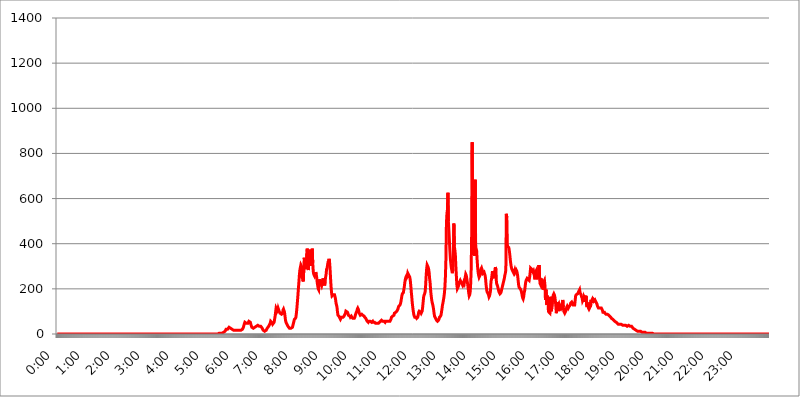
| Category | 2017.07.27. Intenzitás [W/m^2] |
|---|---|
| 0.0 | 0 |
| 0.0006944444444444445 | 0 |
| 0.001388888888888889 | 0 |
| 0.0020833333333333333 | 0 |
| 0.002777777777777778 | 0 |
| 0.003472222222222222 | 0 |
| 0.004166666666666667 | 0 |
| 0.004861111111111111 | 0 |
| 0.005555555555555556 | 0 |
| 0.0062499999999999995 | 0 |
| 0.006944444444444444 | 0 |
| 0.007638888888888889 | 0 |
| 0.008333333333333333 | 0 |
| 0.009027777777777779 | 0 |
| 0.009722222222222222 | 0 |
| 0.010416666666666666 | 0 |
| 0.011111111111111112 | 0 |
| 0.011805555555555555 | 0 |
| 0.012499999999999999 | 0 |
| 0.013194444444444444 | 0 |
| 0.013888888888888888 | 0 |
| 0.014583333333333332 | 0 |
| 0.015277777777777777 | 0 |
| 0.015972222222222224 | 0 |
| 0.016666666666666666 | 0 |
| 0.017361111111111112 | 0 |
| 0.018055555555555557 | 0 |
| 0.01875 | 0 |
| 0.019444444444444445 | 0 |
| 0.02013888888888889 | 0 |
| 0.020833333333333332 | 0 |
| 0.02152777777777778 | 0 |
| 0.022222222222222223 | 0 |
| 0.02291666666666667 | 0 |
| 0.02361111111111111 | 0 |
| 0.024305555555555556 | 0 |
| 0.024999999999999998 | 0 |
| 0.025694444444444447 | 0 |
| 0.02638888888888889 | 0 |
| 0.027083333333333334 | 0 |
| 0.027777777777777776 | 0 |
| 0.02847222222222222 | 0 |
| 0.029166666666666664 | 0 |
| 0.029861111111111113 | 0 |
| 0.030555555555555555 | 0 |
| 0.03125 | 0 |
| 0.03194444444444445 | 0 |
| 0.03263888888888889 | 0 |
| 0.03333333333333333 | 0 |
| 0.034027777777777775 | 0 |
| 0.034722222222222224 | 0 |
| 0.035416666666666666 | 0 |
| 0.036111111111111115 | 0 |
| 0.03680555555555556 | 0 |
| 0.0375 | 0 |
| 0.03819444444444444 | 0 |
| 0.03888888888888889 | 0 |
| 0.03958333333333333 | 0 |
| 0.04027777777777778 | 0 |
| 0.04097222222222222 | 0 |
| 0.041666666666666664 | 0 |
| 0.042361111111111106 | 0 |
| 0.04305555555555556 | 0 |
| 0.043750000000000004 | 0 |
| 0.044444444444444446 | 0 |
| 0.04513888888888889 | 0 |
| 0.04583333333333334 | 0 |
| 0.04652777777777778 | 0 |
| 0.04722222222222222 | 0 |
| 0.04791666666666666 | 0 |
| 0.04861111111111111 | 0 |
| 0.049305555555555554 | 0 |
| 0.049999999999999996 | 0 |
| 0.05069444444444445 | 0 |
| 0.051388888888888894 | 0 |
| 0.052083333333333336 | 0 |
| 0.05277777777777778 | 0 |
| 0.05347222222222222 | 0 |
| 0.05416666666666667 | 0 |
| 0.05486111111111111 | 0 |
| 0.05555555555555555 | 0 |
| 0.05625 | 0 |
| 0.05694444444444444 | 0 |
| 0.057638888888888885 | 0 |
| 0.05833333333333333 | 0 |
| 0.05902777777777778 | 0 |
| 0.059722222222222225 | 0 |
| 0.06041666666666667 | 0 |
| 0.061111111111111116 | 0 |
| 0.06180555555555556 | 0 |
| 0.0625 | 0 |
| 0.06319444444444444 | 0 |
| 0.06388888888888888 | 0 |
| 0.06458333333333334 | 0 |
| 0.06527777777777778 | 0 |
| 0.06597222222222222 | 0 |
| 0.06666666666666667 | 0 |
| 0.06736111111111111 | 0 |
| 0.06805555555555555 | 0 |
| 0.06874999999999999 | 0 |
| 0.06944444444444443 | 0 |
| 0.07013888888888889 | 0 |
| 0.07083333333333333 | 0 |
| 0.07152777777777779 | 0 |
| 0.07222222222222223 | 0 |
| 0.07291666666666667 | 0 |
| 0.07361111111111111 | 0 |
| 0.07430555555555556 | 0 |
| 0.075 | 0 |
| 0.07569444444444444 | 0 |
| 0.0763888888888889 | 0 |
| 0.07708333333333334 | 0 |
| 0.07777777777777778 | 0 |
| 0.07847222222222222 | 0 |
| 0.07916666666666666 | 0 |
| 0.0798611111111111 | 0 |
| 0.08055555555555556 | 0 |
| 0.08125 | 0 |
| 0.08194444444444444 | 0 |
| 0.08263888888888889 | 0 |
| 0.08333333333333333 | 0 |
| 0.08402777777777777 | 0 |
| 0.08472222222222221 | 0 |
| 0.08541666666666665 | 0 |
| 0.08611111111111112 | 0 |
| 0.08680555555555557 | 0 |
| 0.08750000000000001 | 0 |
| 0.08819444444444445 | 0 |
| 0.08888888888888889 | 0 |
| 0.08958333333333333 | 0 |
| 0.09027777777777778 | 0 |
| 0.09097222222222222 | 0 |
| 0.09166666666666667 | 0 |
| 0.09236111111111112 | 0 |
| 0.09305555555555556 | 0 |
| 0.09375 | 0 |
| 0.09444444444444444 | 0 |
| 0.09513888888888888 | 0 |
| 0.09583333333333333 | 0 |
| 0.09652777777777777 | 0 |
| 0.09722222222222222 | 0 |
| 0.09791666666666667 | 0 |
| 0.09861111111111111 | 0 |
| 0.09930555555555555 | 0 |
| 0.09999999999999999 | 0 |
| 0.10069444444444443 | 0 |
| 0.1013888888888889 | 0 |
| 0.10208333333333335 | 0 |
| 0.10277777777777779 | 0 |
| 0.10347222222222223 | 0 |
| 0.10416666666666667 | 0 |
| 0.10486111111111111 | 0 |
| 0.10555555555555556 | 0 |
| 0.10625 | 0 |
| 0.10694444444444444 | 0 |
| 0.1076388888888889 | 0 |
| 0.10833333333333334 | 0 |
| 0.10902777777777778 | 0 |
| 0.10972222222222222 | 0 |
| 0.1111111111111111 | 0 |
| 0.11180555555555556 | 0 |
| 0.11180555555555556 | 0 |
| 0.1125 | 0 |
| 0.11319444444444444 | 0 |
| 0.11388888888888889 | 0 |
| 0.11458333333333333 | 0 |
| 0.11527777777777777 | 0 |
| 0.11597222222222221 | 0 |
| 0.11666666666666665 | 0 |
| 0.1173611111111111 | 0 |
| 0.11805555555555557 | 0 |
| 0.11944444444444445 | 0 |
| 0.12013888888888889 | 0 |
| 0.12083333333333333 | 0 |
| 0.12152777777777778 | 0 |
| 0.12222222222222223 | 0 |
| 0.12291666666666667 | 0 |
| 0.12291666666666667 | 0 |
| 0.12361111111111112 | 0 |
| 0.12430555555555556 | 0 |
| 0.125 | 0 |
| 0.12569444444444444 | 0 |
| 0.12638888888888888 | 0 |
| 0.12708333333333333 | 0 |
| 0.16875 | 0 |
| 0.12847222222222224 | 0 |
| 0.12916666666666668 | 0 |
| 0.12986111111111112 | 0 |
| 0.13055555555555556 | 0 |
| 0.13125 | 0 |
| 0.13194444444444445 | 0 |
| 0.1326388888888889 | 0 |
| 0.13333333333333333 | 0 |
| 0.13402777777777777 | 0 |
| 0.13402777777777777 | 0 |
| 0.13472222222222222 | 0 |
| 0.13541666666666666 | 0 |
| 0.1361111111111111 | 0 |
| 0.13749999999999998 | 0 |
| 0.13819444444444443 | 0 |
| 0.1388888888888889 | 0 |
| 0.13958333333333334 | 0 |
| 0.14027777777777778 | 0 |
| 0.14097222222222222 | 0 |
| 0.14166666666666666 | 0 |
| 0.1423611111111111 | 0 |
| 0.14305555555555557 | 0 |
| 0.14375000000000002 | 0 |
| 0.14444444444444446 | 0 |
| 0.1451388888888889 | 0 |
| 0.1451388888888889 | 0 |
| 0.14652777777777778 | 0 |
| 0.14722222222222223 | 0 |
| 0.14791666666666667 | 0 |
| 0.1486111111111111 | 0 |
| 0.14930555555555555 | 0 |
| 0.15 | 0 |
| 0.15069444444444444 | 0 |
| 0.15138888888888888 | 0 |
| 0.15208333333333332 | 0 |
| 0.15277777777777776 | 0 |
| 0.15347222222222223 | 0 |
| 0.15416666666666667 | 0 |
| 0.15486111111111112 | 0 |
| 0.15555555555555556 | 0 |
| 0.15625 | 0 |
| 0.15694444444444444 | 0 |
| 0.15763888888888888 | 0 |
| 0.15833333333333333 | 0 |
| 0.15902777777777777 | 0 |
| 0.15972222222222224 | 0 |
| 0.16041666666666668 | 0 |
| 0.16111111111111112 | 0 |
| 0.16180555555555556 | 0 |
| 0.1625 | 0 |
| 0.16319444444444445 | 0 |
| 0.1638888888888889 | 0 |
| 0.16458333333333333 | 0 |
| 0.16527777777777777 | 0 |
| 0.16597222222222222 | 0 |
| 0.16666666666666666 | 0 |
| 0.1673611111111111 | 0 |
| 0.16805555555555554 | 0 |
| 0.16874999999999998 | 0 |
| 0.16944444444444443 | 0 |
| 0.17013888888888887 | 0 |
| 0.1708333333333333 | 0 |
| 0.17152777777777775 | 0 |
| 0.17222222222222225 | 0 |
| 0.1729166666666667 | 0 |
| 0.17361111111111113 | 0 |
| 0.17430555555555557 | 0 |
| 0.17500000000000002 | 0 |
| 0.17569444444444446 | 0 |
| 0.1763888888888889 | 0 |
| 0.17708333333333334 | 0 |
| 0.17777777777777778 | 0 |
| 0.17847222222222223 | 0 |
| 0.17916666666666667 | 0 |
| 0.1798611111111111 | 0 |
| 0.18055555555555555 | 0 |
| 0.18125 | 0 |
| 0.18194444444444444 | 0 |
| 0.1826388888888889 | 0 |
| 0.18333333333333335 | 0 |
| 0.1840277777777778 | 0 |
| 0.18472222222222223 | 0 |
| 0.18541666666666667 | 0 |
| 0.18611111111111112 | 0 |
| 0.18680555555555556 | 0 |
| 0.1875 | 0 |
| 0.18819444444444444 | 0 |
| 0.18888888888888888 | 0 |
| 0.18958333333333333 | 0 |
| 0.19027777777777777 | 0 |
| 0.1909722222222222 | 0 |
| 0.19166666666666665 | 0 |
| 0.19236111111111112 | 0 |
| 0.19305555555555554 | 0 |
| 0.19375 | 0 |
| 0.19444444444444445 | 0 |
| 0.1951388888888889 | 0 |
| 0.19583333333333333 | 0 |
| 0.19652777777777777 | 0 |
| 0.19722222222222222 | 0 |
| 0.19791666666666666 | 0 |
| 0.1986111111111111 | 0 |
| 0.19930555555555554 | 0 |
| 0.19999999999999998 | 0 |
| 0.20069444444444443 | 0 |
| 0.20138888888888887 | 0 |
| 0.2020833333333333 | 0 |
| 0.2027777777777778 | 0 |
| 0.2034722222222222 | 0 |
| 0.2041666666666667 | 0 |
| 0.20486111111111113 | 0 |
| 0.20555555555555557 | 0 |
| 0.20625000000000002 | 0 |
| 0.20694444444444446 | 0 |
| 0.2076388888888889 | 0 |
| 0.20833333333333334 | 0 |
| 0.20902777777777778 | 0 |
| 0.20972222222222223 | 0 |
| 0.21041666666666667 | 0 |
| 0.2111111111111111 | 0 |
| 0.21180555555555555 | 0 |
| 0.2125 | 0 |
| 0.21319444444444444 | 0 |
| 0.2138888888888889 | 0 |
| 0.21458333333333335 | 0 |
| 0.2152777777777778 | 0 |
| 0.21597222222222223 | 0 |
| 0.21666666666666667 | 0 |
| 0.21736111111111112 | 0 |
| 0.21805555555555556 | 0 |
| 0.21875 | 0 |
| 0.21944444444444444 | 0 |
| 0.22013888888888888 | 0 |
| 0.22083333333333333 | 0 |
| 0.22152777777777777 | 0 |
| 0.2222222222222222 | 0 |
| 0.22291666666666665 | 0 |
| 0.2236111111111111 | 0 |
| 0.22430555555555556 | 0 |
| 0.225 | 0 |
| 0.22569444444444445 | 0 |
| 0.2263888888888889 | 3.525 |
| 0.22708333333333333 | 3.525 |
| 0.22777777777777777 | 3.525 |
| 0.22847222222222222 | 3.525 |
| 0.22916666666666666 | 3.525 |
| 0.2298611111111111 | 3.525 |
| 0.23055555555555554 | 3.525 |
| 0.23124999999999998 | 3.525 |
| 0.23194444444444443 | 3.525 |
| 0.23263888888888887 | 3.525 |
| 0.2333333333333333 | 7.887 |
| 0.2340277777777778 | 7.887 |
| 0.2347222222222222 | 12.257 |
| 0.2354166666666667 | 12.257 |
| 0.23611111111111113 | 16.636 |
| 0.23680555555555557 | 21.024 |
| 0.23750000000000002 | 21.024 |
| 0.23819444444444446 | 21.024 |
| 0.2388888888888889 | 21.024 |
| 0.23958333333333334 | 25.419 |
| 0.24027777777777778 | 25.419 |
| 0.24097222222222223 | 29.823 |
| 0.24166666666666667 | 29.823 |
| 0.2423611111111111 | 29.823 |
| 0.24305555555555555 | 25.419 |
| 0.24375 | 21.024 |
| 0.24444444444444446 | 21.024 |
| 0.24513888888888888 | 21.024 |
| 0.24583333333333335 | 21.024 |
| 0.2465277777777778 | 16.636 |
| 0.24722222222222223 | 16.636 |
| 0.24791666666666667 | 16.636 |
| 0.24861111111111112 | 16.636 |
| 0.24930555555555556 | 16.636 |
| 0.25 | 16.636 |
| 0.25069444444444444 | 16.636 |
| 0.2513888888888889 | 16.636 |
| 0.2520833333333333 | 16.636 |
| 0.25277777777777777 | 16.636 |
| 0.2534722222222222 | 16.636 |
| 0.25416666666666665 | 16.636 |
| 0.2548611111111111 | 16.636 |
| 0.2555555555555556 | 16.636 |
| 0.25625000000000003 | 12.257 |
| 0.2569444444444445 | 12.257 |
| 0.2576388888888889 | 16.636 |
| 0.25833333333333336 | 16.636 |
| 0.2590277777777778 | 21.024 |
| 0.25972222222222224 | 21.024 |
| 0.2604166666666667 | 25.419 |
| 0.2611111111111111 | 29.823 |
| 0.26180555555555557 | 38.653 |
| 0.2625 | 43.079 |
| 0.26319444444444445 | 51.951 |
| 0.2638888888888889 | 51.951 |
| 0.26458333333333334 | 51.951 |
| 0.2652777777777778 | 47.511 |
| 0.2659722222222222 | 47.511 |
| 0.26666666666666666 | 47.511 |
| 0.2673611111111111 | 47.511 |
| 0.26805555555555555 | 51.951 |
| 0.26875 | 56.398 |
| 0.26944444444444443 | 56.398 |
| 0.2701388888888889 | 56.398 |
| 0.2708333333333333 | 51.951 |
| 0.27152777777777776 | 43.079 |
| 0.2722222222222222 | 38.653 |
| 0.27291666666666664 | 29.823 |
| 0.2736111111111111 | 29.823 |
| 0.2743055555555555 | 25.419 |
| 0.27499999999999997 | 25.419 |
| 0.27569444444444446 | 29.823 |
| 0.27638888888888885 | 29.823 |
| 0.27708333333333335 | 29.823 |
| 0.2777777777777778 | 29.823 |
| 0.27847222222222223 | 29.823 |
| 0.2791666666666667 | 34.234 |
| 0.2798611111111111 | 38.653 |
| 0.28055555555555556 | 38.653 |
| 0.28125 | 38.653 |
| 0.28194444444444444 | 34.234 |
| 0.2826388888888889 | 34.234 |
| 0.2833333333333333 | 34.234 |
| 0.28402777777777777 | 38.653 |
| 0.2847222222222222 | 38.653 |
| 0.28541666666666665 | 34.234 |
| 0.28611111111111115 | 29.823 |
| 0.28680555555555554 | 29.823 |
| 0.28750000000000003 | 25.419 |
| 0.2881944444444445 | 21.024 |
| 0.2888888888888889 | 16.636 |
| 0.28958333333333336 | 16.636 |
| 0.2902777777777778 | 12.257 |
| 0.29097222222222224 | 12.257 |
| 0.2916666666666667 | 12.257 |
| 0.2923611111111111 | 16.636 |
| 0.29305555555555557 | 16.636 |
| 0.29375 | 21.024 |
| 0.29444444444444445 | 25.419 |
| 0.2951388888888889 | 25.419 |
| 0.29583333333333334 | 29.823 |
| 0.2965277777777778 | 34.234 |
| 0.2972222222222222 | 38.653 |
| 0.29791666666666666 | 43.079 |
| 0.2986111111111111 | 47.511 |
| 0.29930555555555555 | 56.398 |
| 0.3 | 56.398 |
| 0.30069444444444443 | 51.951 |
| 0.3013888888888889 | 47.511 |
| 0.3020833333333333 | 43.079 |
| 0.30277777777777776 | 38.653 |
| 0.3034722222222222 | 43.079 |
| 0.30416666666666664 | 51.951 |
| 0.3048611111111111 | 65.31 |
| 0.3055555555555555 | 78.722 |
| 0.30624999999999997 | 96.682 |
| 0.3069444444444444 | 114.716 |
| 0.3076388888888889 | 110.201 |
| 0.30833333333333335 | 101.184 |
| 0.3090277777777778 | 105.69 |
| 0.30972222222222223 | 114.716 |
| 0.3104166666666667 | 114.716 |
| 0.3111111111111111 | 101.184 |
| 0.31180555555555556 | 96.682 |
| 0.3125 | 92.184 |
| 0.31319444444444444 | 92.184 |
| 0.3138888888888889 | 92.184 |
| 0.3145833333333333 | 87.692 |
| 0.31527777777777777 | 87.692 |
| 0.3159722222222222 | 92.184 |
| 0.31666666666666665 | 105.69 |
| 0.31736111111111115 | 110.201 |
| 0.31805555555555554 | 110.201 |
| 0.31875000000000003 | 96.682 |
| 0.3194444444444445 | 78.722 |
| 0.3201388888888889 | 60.85 |
| 0.32083333333333336 | 51.951 |
| 0.3215277777777778 | 47.511 |
| 0.32222222222222224 | 43.079 |
| 0.3229166666666667 | 38.653 |
| 0.3236111111111111 | 34.234 |
| 0.32430555555555557 | 29.823 |
| 0.325 | 29.823 |
| 0.32569444444444445 | 25.419 |
| 0.3263888888888889 | 25.419 |
| 0.32708333333333334 | 25.419 |
| 0.3277777777777778 | 25.419 |
| 0.3284722222222222 | 25.419 |
| 0.32916666666666666 | 25.419 |
| 0.3298611111111111 | 29.823 |
| 0.33055555555555555 | 38.653 |
| 0.33125 | 47.511 |
| 0.33194444444444443 | 56.398 |
| 0.3326388888888889 | 65.31 |
| 0.3333333333333333 | 65.31 |
| 0.3340277777777778 | 69.775 |
| 0.3347222222222222 | 74.246 |
| 0.3354166666666667 | 92.184 |
| 0.3361111111111111 | 114.716 |
| 0.3368055555555556 | 141.884 |
| 0.33749999999999997 | 169.156 |
| 0.33819444444444446 | 201.058 |
| 0.33888888888888885 | 228.436 |
| 0.33958333333333335 | 260.373 |
| 0.34027777777777773 | 283.156 |
| 0.34097222222222223 | 283.156 |
| 0.3416666666666666 | 305.898 |
| 0.3423611111111111 | 305.898 |
| 0.3430555555555555 | 296.808 |
| 0.34375 | 251.251 |
| 0.3444444444444445 | 237.564 |
| 0.3451388888888889 | 233 |
| 0.3458333333333334 | 296.808 |
| 0.34652777777777777 | 337.639 |
| 0.34722222222222227 | 287.709 |
| 0.34791666666666665 | 305.898 |
| 0.34861111111111115 | 314.98 |
| 0.34930555555555554 | 287.709 |
| 0.35000000000000003 | 355.712 |
| 0.3506944444444444 | 378.224 |
| 0.3513888888888889 | 305.898 |
| 0.3520833333333333 | 283.156 |
| 0.3527777777777778 | 283.156 |
| 0.3534722222222222 | 351.198 |
| 0.3541666666666667 | 333.113 |
| 0.3548611111111111 | 301.354 |
| 0.35555555555555557 | 373.729 |
| 0.35625 | 324.052 |
| 0.35694444444444445 | 346.682 |
| 0.3576388888888889 | 378.224 |
| 0.35833333333333334 | 314.98 |
| 0.3590277777777778 | 278.603 |
| 0.3597222222222222 | 264.932 |
| 0.36041666666666666 | 260.373 |
| 0.3611111111111111 | 255.813 |
| 0.36180555555555555 | 260.373 |
| 0.3625 | 274.047 |
| 0.36319444444444443 | 264.932 |
| 0.3638888888888889 | 251.251 |
| 0.3645833333333333 | 228.436 |
| 0.3652777777777778 | 214.746 |
| 0.3659722222222222 | 201.058 |
| 0.3666666666666667 | 196.497 |
| 0.3673611111111111 | 223.873 |
| 0.3680555555555556 | 242.127 |
| 0.36874999999999997 | 233 |
| 0.36944444444444446 | 233 |
| 0.37013888888888885 | 233 |
| 0.37083333333333335 | 214.746 |
| 0.37152777777777773 | 214.746 |
| 0.37222222222222223 | 233 |
| 0.3729166666666666 | 246.689 |
| 0.3736111111111111 | 237.564 |
| 0.3743055555555555 | 228.436 |
| 0.375 | 214.746 |
| 0.3756944444444445 | 233 |
| 0.3763888888888889 | 251.251 |
| 0.3770833333333334 | 264.932 |
| 0.37777777777777777 | 287.709 |
| 0.37847222222222227 | 292.259 |
| 0.37916666666666665 | 305.898 |
| 0.37986111111111115 | 319.517 |
| 0.38055555555555554 | 324.052 |
| 0.38125000000000003 | 333.113 |
| 0.3819444444444444 | 319.517 |
| 0.3826388888888889 | 287.709 |
| 0.3833333333333333 | 246.689 |
| 0.3840277777777778 | 210.182 |
| 0.3847222222222222 | 182.82 |
| 0.3854166666666667 | 169.156 |
| 0.3861111111111111 | 169.156 |
| 0.38680555555555557 | 173.709 |
| 0.3875 | 173.709 |
| 0.38819444444444445 | 173.709 |
| 0.3888888888888889 | 173.709 |
| 0.38958333333333334 | 164.605 |
| 0.3902777777777778 | 155.509 |
| 0.3909722222222222 | 137.347 |
| 0.39166666666666666 | 128.284 |
| 0.3923611111111111 | 119.235 |
| 0.39305555555555555 | 96.682 |
| 0.39375 | 83.205 |
| 0.39444444444444443 | 83.205 |
| 0.3951388888888889 | 78.722 |
| 0.3958333333333333 | 74.246 |
| 0.3965277777777778 | 69.775 |
| 0.3972222222222222 | 65.31 |
| 0.3979166666666667 | 65.31 |
| 0.3986111111111111 | 74.246 |
| 0.3993055555555556 | 74.246 |
| 0.39999999999999997 | 74.246 |
| 0.40069444444444446 | 74.246 |
| 0.40138888888888885 | 74.246 |
| 0.40208333333333335 | 78.722 |
| 0.40277777777777773 | 83.205 |
| 0.40347222222222223 | 87.692 |
| 0.4041666666666666 | 92.184 |
| 0.4048611111111111 | 101.184 |
| 0.4055555555555555 | 101.184 |
| 0.40625 | 101.184 |
| 0.4069444444444445 | 96.682 |
| 0.4076388888888889 | 92.184 |
| 0.4083333333333334 | 83.205 |
| 0.40902777777777777 | 83.205 |
| 0.40972222222222227 | 83.205 |
| 0.41041666666666665 | 78.722 |
| 0.41111111111111115 | 74.246 |
| 0.41180555555555554 | 74.246 |
| 0.41250000000000003 | 78.722 |
| 0.4131944444444444 | 74.246 |
| 0.4138888888888889 | 74.246 |
| 0.4145833333333333 | 69.775 |
| 0.4152777777777778 | 69.775 |
| 0.4159722222222222 | 69.775 |
| 0.4166666666666667 | 69.775 |
| 0.4173611111111111 | 74.246 |
| 0.41805555555555557 | 83.205 |
| 0.41875 | 83.205 |
| 0.41944444444444445 | 96.682 |
| 0.4201388888888889 | 101.184 |
| 0.42083333333333334 | 110.201 |
| 0.4215277777777778 | 114.716 |
| 0.4222222222222222 | 110.201 |
| 0.42291666666666666 | 101.184 |
| 0.4236111111111111 | 92.184 |
| 0.42430555555555555 | 87.692 |
| 0.425 | 83.205 |
| 0.42569444444444443 | 83.205 |
| 0.4263888888888889 | 83.205 |
| 0.4270833333333333 | 87.692 |
| 0.4277777777777778 | 87.692 |
| 0.4284722222222222 | 83.205 |
| 0.4291666666666667 | 83.205 |
| 0.4298611111111111 | 83.205 |
| 0.4305555555555556 | 78.722 |
| 0.43124999999999997 | 74.246 |
| 0.43194444444444446 | 74.246 |
| 0.43263888888888885 | 69.775 |
| 0.43333333333333335 | 65.31 |
| 0.43402777777777773 | 65.31 |
| 0.43472222222222223 | 56.398 |
| 0.4354166666666666 | 56.398 |
| 0.4361111111111111 | 51.951 |
| 0.4368055555555555 | 56.398 |
| 0.4375 | 56.398 |
| 0.4381944444444445 | 56.398 |
| 0.4388888888888889 | 56.398 |
| 0.4395833333333334 | 56.398 |
| 0.44027777777777777 | 56.398 |
| 0.44097222222222227 | 51.951 |
| 0.44166666666666665 | 51.951 |
| 0.44236111111111115 | 56.398 |
| 0.44305555555555554 | 51.951 |
| 0.44375000000000003 | 51.951 |
| 0.4444444444444444 | 51.951 |
| 0.4451388888888889 | 51.951 |
| 0.4458333333333333 | 51.951 |
| 0.4465277777777778 | 47.511 |
| 0.4472222222222222 | 47.511 |
| 0.4479166666666667 | 47.511 |
| 0.4486111111111111 | 47.511 |
| 0.44930555555555557 | 47.511 |
| 0.45 | 47.511 |
| 0.45069444444444445 | 47.511 |
| 0.4513888888888889 | 47.511 |
| 0.45208333333333334 | 51.951 |
| 0.4527777777777778 | 51.951 |
| 0.4534722222222222 | 56.398 |
| 0.45416666666666666 | 56.398 |
| 0.4548611111111111 | 60.85 |
| 0.45555555555555555 | 60.85 |
| 0.45625 | 56.398 |
| 0.45694444444444443 | 56.398 |
| 0.4576388888888889 | 56.398 |
| 0.4583333333333333 | 56.398 |
| 0.4590277777777778 | 56.398 |
| 0.4597222222222222 | 51.951 |
| 0.4604166666666667 | 56.398 |
| 0.4611111111111111 | 56.398 |
| 0.4618055555555556 | 56.398 |
| 0.46249999999999997 | 56.398 |
| 0.46319444444444446 | 56.398 |
| 0.46388888888888885 | 56.398 |
| 0.46458333333333335 | 56.398 |
| 0.46527777777777773 | 56.398 |
| 0.46597222222222223 | 56.398 |
| 0.4666666666666666 | 56.398 |
| 0.4673611111111111 | 60.85 |
| 0.4680555555555555 | 65.31 |
| 0.46875 | 74.246 |
| 0.4694444444444445 | 74.246 |
| 0.4701388888888889 | 78.722 |
| 0.4708333333333334 | 78.722 |
| 0.47152777777777777 | 78.722 |
| 0.47222222222222227 | 83.205 |
| 0.47291666666666665 | 92.184 |
| 0.47361111111111115 | 92.184 |
| 0.47430555555555554 | 92.184 |
| 0.47500000000000003 | 96.682 |
| 0.4756944444444444 | 96.682 |
| 0.4763888888888889 | 101.184 |
| 0.4770833333333333 | 105.69 |
| 0.4777777777777778 | 110.201 |
| 0.4784722222222222 | 119.235 |
| 0.4791666666666667 | 123.758 |
| 0.4798611111111111 | 123.758 |
| 0.48055555555555557 | 128.284 |
| 0.48125 | 132.814 |
| 0.48194444444444445 | 141.884 |
| 0.4826388888888889 | 155.509 |
| 0.48333333333333334 | 169.156 |
| 0.4840277777777778 | 178.264 |
| 0.4847222222222222 | 178.264 |
| 0.48541666666666666 | 182.82 |
| 0.4861111111111111 | 196.497 |
| 0.48680555555555555 | 210.182 |
| 0.4875 | 228.436 |
| 0.48819444444444443 | 242.127 |
| 0.4888888888888889 | 251.251 |
| 0.4895833333333333 | 255.813 |
| 0.4902777777777778 | 251.251 |
| 0.4909722222222222 | 255.813 |
| 0.4916666666666667 | 269.49 |
| 0.4923611111111111 | 269.49 |
| 0.4930555555555556 | 260.373 |
| 0.49374999999999997 | 255.813 |
| 0.49444444444444446 | 251.251 |
| 0.49513888888888885 | 237.564 |
| 0.49583333333333335 | 214.746 |
| 0.49652777777777773 | 187.378 |
| 0.49722222222222223 | 164.605 |
| 0.4979166666666666 | 137.347 |
| 0.4986111111111111 | 119.235 |
| 0.4993055555555555 | 101.184 |
| 0.5 | 87.692 |
| 0.5006944444444444 | 78.722 |
| 0.5013888888888889 | 74.246 |
| 0.5020833333333333 | 74.246 |
| 0.5027777777777778 | 74.246 |
| 0.5034722222222222 | 74.246 |
| 0.5041666666666667 | 69.775 |
| 0.5048611111111111 | 69.775 |
| 0.5055555555555555 | 74.246 |
| 0.50625 | 83.205 |
| 0.5069444444444444 | 96.682 |
| 0.5076388888888889 | 101.184 |
| 0.5083333333333333 | 101.184 |
| 0.5090277777777777 | 101.184 |
| 0.5097222222222222 | 96.682 |
| 0.5104166666666666 | 92.184 |
| 0.5111111111111112 | 96.682 |
| 0.5118055555555555 | 101.184 |
| 0.5125000000000001 | 119.235 |
| 0.5131944444444444 | 141.884 |
| 0.513888888888889 | 164.605 |
| 0.5145833333333333 | 173.709 |
| 0.5152777777777778 | 178.264 |
| 0.5159722222222222 | 187.378 |
| 0.5166666666666667 | 214.746 |
| 0.517361111111111 | 255.813 |
| 0.5180555555555556 | 287.709 |
| 0.5187499999999999 | 305.898 |
| 0.5194444444444445 | 305.898 |
| 0.5201388888888888 | 296.808 |
| 0.5208333333333334 | 287.709 |
| 0.5215277777777778 | 274.047 |
| 0.5222222222222223 | 246.689 |
| 0.5229166666666667 | 228.436 |
| 0.5236111111111111 | 196.497 |
| 0.5243055555555556 | 173.709 |
| 0.525 | 155.509 |
| 0.5256944444444445 | 141.884 |
| 0.5263888888888889 | 132.814 |
| 0.5270833333333333 | 123.758 |
| 0.5277777777777778 | 110.201 |
| 0.5284722222222222 | 92.184 |
| 0.5291666666666667 | 78.722 |
| 0.5298611111111111 | 74.246 |
| 0.5305555555555556 | 69.775 |
| 0.53125 | 65.31 |
| 0.5319444444444444 | 60.85 |
| 0.5326388888888889 | 60.85 |
| 0.5333333333333333 | 56.398 |
| 0.5340277777777778 | 56.398 |
| 0.5347222222222222 | 60.85 |
| 0.5354166666666667 | 65.31 |
| 0.5361111111111111 | 74.246 |
| 0.5368055555555555 | 74.246 |
| 0.5375 | 78.722 |
| 0.5381944444444444 | 83.205 |
| 0.5388888888888889 | 96.682 |
| 0.5395833333333333 | 110.201 |
| 0.5402777777777777 | 128.284 |
| 0.5409722222222222 | 137.347 |
| 0.5416666666666666 | 150.964 |
| 0.5423611111111112 | 164.605 |
| 0.5430555555555555 | 182.82 |
| 0.5437500000000001 | 210.182 |
| 0.5444444444444444 | 255.813 |
| 0.545138888888889 | 333.113 |
| 0.5458333333333333 | 489.108 |
| 0.5465277777777778 | 532.513 |
| 0.5472222222222222 | 549.704 |
| 0.5479166666666667 | 625.784 |
| 0.548611111111111 | 497.836 |
| 0.5493055555555556 | 458.38 |
| 0.5499999999999999 | 414.035 |
| 0.5506944444444445 | 369.23 |
| 0.5513888888888888 | 333.113 |
| 0.5520833333333334 | 310.44 |
| 0.5527777777777778 | 292.259 |
| 0.5534722222222223 | 292.259 |
| 0.5541666666666667 | 269.49 |
| 0.5548611111111111 | 287.709 |
| 0.5555555555555556 | 346.682 |
| 0.55625 | 489.108 |
| 0.5569444444444445 | 387.202 |
| 0.5576388888888889 | 373.729 |
| 0.5583333333333333 | 351.198 |
| 0.5590277777777778 | 301.354 |
| 0.5597222222222222 | 260.373 |
| 0.5604166666666667 | 219.309 |
| 0.5611111111111111 | 201.058 |
| 0.5618055555555556 | 201.058 |
| 0.5625 | 210.182 |
| 0.5631944444444444 | 219.309 |
| 0.5638888888888889 | 228.436 |
| 0.5645833333333333 | 233 |
| 0.5652777777777778 | 237.564 |
| 0.5659722222222222 | 233 |
| 0.5666666666666667 | 228.436 |
| 0.5673611111111111 | 228.436 |
| 0.5680555555555555 | 219.309 |
| 0.56875 | 214.746 |
| 0.5694444444444444 | 219.309 |
| 0.5701388888888889 | 228.436 |
| 0.5708333333333333 | 223.873 |
| 0.5715277777777777 | 223.873 |
| 0.5722222222222222 | 251.251 |
| 0.5729166666666666 | 264.932 |
| 0.5736111111111112 | 260.373 |
| 0.5743055555555555 | 246.689 |
| 0.5750000000000001 | 233 |
| 0.5756944444444444 | 219.309 |
| 0.576388888888889 | 201.058 |
| 0.5770833333333333 | 182.82 |
| 0.5777777777777778 | 169.156 |
| 0.5784722222222222 | 173.709 |
| 0.5791666666666667 | 187.378 |
| 0.579861111111111 | 223.873 |
| 0.5805555555555556 | 287.709 |
| 0.5812499999999999 | 445.129 |
| 0.5819444444444445 | 849.199 |
| 0.5826388888888888 | 418.492 |
| 0.5833333333333334 | 409.574 |
| 0.5840277777777778 | 418.492 |
| 0.5847222222222223 | 360.221 |
| 0.5854166666666667 | 346.682 |
| 0.5861111111111111 | 683.473 |
| 0.5868055555555556 | 387.202 |
| 0.5875 | 387.202 |
| 0.5881944444444445 | 369.23 |
| 0.5888888888888889 | 328.584 |
| 0.5895833333333333 | 296.808 |
| 0.5902777777777778 | 274.047 |
| 0.5909722222222222 | 260.373 |
| 0.5916666666666667 | 251.251 |
| 0.5923611111111111 | 251.251 |
| 0.5930555555555556 | 260.373 |
| 0.59375 | 269.49 |
| 0.5944444444444444 | 287.709 |
| 0.5951388888888889 | 292.259 |
| 0.5958333333333333 | 292.259 |
| 0.5965277777777778 | 278.603 |
| 0.5972222222222222 | 269.49 |
| 0.5979166666666667 | 269.49 |
| 0.5986111111111111 | 274.047 |
| 0.5993055555555555 | 274.047 |
| 0.6 | 260.373 |
| 0.6006944444444444 | 246.689 |
| 0.6013888888888889 | 219.309 |
| 0.6020833333333333 | 201.058 |
| 0.6027777777777777 | 187.378 |
| 0.6034722222222222 | 182.82 |
| 0.6041666666666666 | 178.264 |
| 0.6048611111111112 | 173.709 |
| 0.6055555555555555 | 164.605 |
| 0.6062500000000001 | 169.156 |
| 0.6069444444444444 | 178.264 |
| 0.607638888888889 | 191.937 |
| 0.6083333333333333 | 233 |
| 0.6090277777777778 | 242.127 |
| 0.6097222222222222 | 260.373 |
| 0.6104166666666667 | 278.603 |
| 0.611111111111111 | 269.49 |
| 0.6118055555555556 | 264.932 |
| 0.6124999999999999 | 264.932 |
| 0.6131944444444445 | 246.689 |
| 0.6138888888888888 | 246.689 |
| 0.6145833333333334 | 296.808 |
| 0.6152777777777778 | 283.156 |
| 0.6159722222222223 | 228.436 |
| 0.6166666666666667 | 219.309 |
| 0.6173611111111111 | 214.746 |
| 0.6180555555555556 | 205.62 |
| 0.61875 | 196.497 |
| 0.6194444444444445 | 187.378 |
| 0.6201388888888889 | 182.82 |
| 0.6208333333333333 | 178.264 |
| 0.6215277777777778 | 178.264 |
| 0.6222222222222222 | 182.82 |
| 0.6229166666666667 | 191.937 |
| 0.6236111111111111 | 201.058 |
| 0.6243055555555556 | 210.182 |
| 0.625 | 219.309 |
| 0.6256944444444444 | 228.436 |
| 0.6263888888888889 | 237.564 |
| 0.6270833333333333 | 246.689 |
| 0.6277777777777778 | 260.373 |
| 0.6284722222222222 | 269.49 |
| 0.6291666666666667 | 283.156 |
| 0.6298611111111111 | 532.513 |
| 0.6305555555555555 | 515.223 |
| 0.63125 | 396.164 |
| 0.6319444444444444 | 387.202 |
| 0.6326388888888889 | 387.202 |
| 0.6333333333333333 | 382.715 |
| 0.6340277777777777 | 369.23 |
| 0.6347222222222222 | 351.198 |
| 0.6354166666666666 | 328.584 |
| 0.6361111111111112 | 310.44 |
| 0.6368055555555555 | 296.808 |
| 0.6375000000000001 | 287.709 |
| 0.6381944444444444 | 283.156 |
| 0.638888888888889 | 278.603 |
| 0.6395833333333333 | 274.047 |
| 0.6402777777777778 | 269.49 |
| 0.6409722222222222 | 269.49 |
| 0.6416666666666667 | 283.156 |
| 0.642361111111111 | 274.047 |
| 0.6430555555555556 | 278.603 |
| 0.6437499999999999 | 283.156 |
| 0.6444444444444445 | 278.603 |
| 0.6451388888888888 | 269.49 |
| 0.6458333333333334 | 255.813 |
| 0.6465277777777778 | 233 |
| 0.6472222222222223 | 214.746 |
| 0.6479166666666667 | 205.62 |
| 0.6486111111111111 | 205.62 |
| 0.6493055555555556 | 201.058 |
| 0.65 | 201.058 |
| 0.6506944444444445 | 191.937 |
| 0.6513888888888889 | 182.82 |
| 0.6520833333333333 | 169.156 |
| 0.6527777777777778 | 160.056 |
| 0.6534722222222222 | 155.509 |
| 0.6541666666666667 | 164.605 |
| 0.6548611111111111 | 182.82 |
| 0.6555555555555556 | 191.937 |
| 0.65625 | 210.182 |
| 0.6569444444444444 | 228.436 |
| 0.6576388888888889 | 237.564 |
| 0.6583333333333333 | 242.127 |
| 0.6590277777777778 | 246.689 |
| 0.6597222222222222 | 246.689 |
| 0.6604166666666667 | 242.127 |
| 0.6611111111111111 | 242.127 |
| 0.6618055555555555 | 237.564 |
| 0.6625 | 251.251 |
| 0.6631944444444444 | 269.49 |
| 0.6638888888888889 | 292.259 |
| 0.6645833333333333 | 292.259 |
| 0.6652777777777777 | 287.709 |
| 0.6659722222222222 | 287.709 |
| 0.6666666666666666 | 278.603 |
| 0.6673611111111111 | 274.047 |
| 0.6680555555555556 | 278.603 |
| 0.6687500000000001 | 269.49 |
| 0.6694444444444444 | 251.251 |
| 0.6701388888888888 | 242.127 |
| 0.6708333333333334 | 274.047 |
| 0.6715277777777778 | 278.603 |
| 0.6722222222222222 | 255.813 |
| 0.6729166666666666 | 242.127 |
| 0.6736111111111112 | 242.127 |
| 0.6743055555555556 | 264.932 |
| 0.6749999999999999 | 255.813 |
| 0.6756944444444444 | 305.898 |
| 0.6763888888888889 | 260.373 |
| 0.6770833333333334 | 223.873 |
| 0.6777777777777777 | 219.309 |
| 0.6784722222222223 | 246.689 |
| 0.6791666666666667 | 233 |
| 0.6798611111111111 | 219.309 |
| 0.6805555555555555 | 223.873 |
| 0.68125 | 223.873 |
| 0.6819444444444445 | 196.497 |
| 0.6826388888888889 | 233 |
| 0.6833333333333332 | 237.564 |
| 0.6840277777777778 | 214.746 |
| 0.6847222222222222 | 150.964 |
| 0.6854166666666667 | 196.497 |
| 0.686111111111111 | 196.497 |
| 0.6868055555555556 | 128.284 |
| 0.6875 | 169.156 |
| 0.6881944444444444 | 160.056 |
| 0.688888888888889 | 101.184 |
| 0.6895833333333333 | 96.682 |
| 0.6902777777777778 | 96.682 |
| 0.6909722222222222 | 92.184 |
| 0.6916666666666668 | 146.423 |
| 0.6923611111111111 | 164.605 |
| 0.6930555555555555 | 101.184 |
| 0.69375 | 101.184 |
| 0.6944444444444445 | 101.184 |
| 0.6951388888888889 | 164.605 |
| 0.6958333333333333 | 173.709 |
| 0.6965277777777777 | 178.264 |
| 0.6972222222222223 | 173.709 |
| 0.6979166666666666 | 164.605 |
| 0.6986111111111111 | 146.423 |
| 0.6993055555555556 | 123.758 |
| 0.7000000000000001 | 92.184 |
| 0.7006944444444444 | 114.716 |
| 0.7013888888888888 | 141.884 |
| 0.7020833333333334 | 123.758 |
| 0.7027777777777778 | 128.284 |
| 0.7034722222222222 | 101.184 |
| 0.7041666666666666 | 114.716 |
| 0.7048611111111112 | 128.284 |
| 0.7055555555555556 | 123.758 |
| 0.7062499999999999 | 123.758 |
| 0.7069444444444444 | 114.716 |
| 0.7076388888888889 | 119.235 |
| 0.7083333333333334 | 128.284 |
| 0.7090277777777777 | 150.964 |
| 0.7097222222222223 | 119.235 |
| 0.7104166666666667 | 101.184 |
| 0.7111111111111111 | 96.682 |
| 0.7118055555555555 | 92.184 |
| 0.7125 | 96.682 |
| 0.7131944444444445 | 101.184 |
| 0.7138888888888889 | 110.201 |
| 0.7145833333333332 | 119.235 |
| 0.7152777777777778 | 123.758 |
| 0.7159722222222222 | 119.235 |
| 0.7166666666666667 | 114.716 |
| 0.717361111111111 | 119.235 |
| 0.7180555555555556 | 119.235 |
| 0.71875 | 119.235 |
| 0.7194444444444444 | 128.284 |
| 0.720138888888889 | 137.347 |
| 0.7208333333333333 | 137.347 |
| 0.7215277777777778 | 141.884 |
| 0.7222222222222222 | 137.347 |
| 0.7229166666666668 | 137.347 |
| 0.7236111111111111 | 128.284 |
| 0.7243055555555555 | 128.284 |
| 0.725 | 128.284 |
| 0.7256944444444445 | 128.284 |
| 0.7263888888888889 | 128.284 |
| 0.7270833333333333 | 169.156 |
| 0.7277777777777777 | 173.709 |
| 0.7284722222222223 | 173.709 |
| 0.7291666666666666 | 173.709 |
| 0.7298611111111111 | 178.264 |
| 0.7305555555555556 | 182.82 |
| 0.7312500000000001 | 187.378 |
| 0.7319444444444444 | 191.937 |
| 0.7326388888888888 | 196.497 |
| 0.7333333333333334 | 182.82 |
| 0.7340277777777778 | 182.82 |
| 0.7347222222222222 | 173.709 |
| 0.7354166666666666 | 164.605 |
| 0.7361111111111112 | 160.056 |
| 0.7368055555555556 | 146.423 |
| 0.7374999999999999 | 150.964 |
| 0.7381944444444444 | 141.884 |
| 0.7388888888888889 | 164.605 |
| 0.7395833333333334 | 160.056 |
| 0.7402777777777777 | 169.156 |
| 0.7409722222222223 | 141.884 |
| 0.7416666666666667 | 169.156 |
| 0.7423611111111111 | 128.284 |
| 0.7430555555555555 | 119.235 |
| 0.74375 | 128.284 |
| 0.7444444444444445 | 123.758 |
| 0.7451388888888889 | 114.716 |
| 0.7458333333333332 | 110.201 |
| 0.7465277777777778 | 114.716 |
| 0.7472222222222222 | 141.884 |
| 0.7479166666666667 | 119.235 |
| 0.748611111111111 | 150.964 |
| 0.7493055555555556 | 146.423 |
| 0.75 | 150.964 |
| 0.7506944444444444 | 137.347 |
| 0.751388888888889 | 146.423 |
| 0.7520833333333333 | 150.964 |
| 0.7527777777777778 | 146.423 |
| 0.7534722222222222 | 146.423 |
| 0.7541666666666668 | 150.964 |
| 0.7548611111111111 | 146.423 |
| 0.7555555555555555 | 141.884 |
| 0.75625 | 137.347 |
| 0.7569444444444445 | 132.814 |
| 0.7576388888888889 | 123.758 |
| 0.7583333333333333 | 119.235 |
| 0.7590277777777777 | 114.716 |
| 0.7597222222222223 | 114.716 |
| 0.7604166666666666 | 114.716 |
| 0.7611111111111111 | 114.716 |
| 0.7618055555555556 | 114.716 |
| 0.7625000000000001 | 114.716 |
| 0.7631944444444444 | 114.716 |
| 0.7638888888888888 | 110.201 |
| 0.7645833333333334 | 105.69 |
| 0.7652777777777778 | 96.682 |
| 0.7659722222222222 | 96.682 |
| 0.7666666666666666 | 96.682 |
| 0.7673611111111112 | 96.682 |
| 0.7680555555555556 | 92.184 |
| 0.7687499999999999 | 92.184 |
| 0.7694444444444444 | 87.692 |
| 0.7701388888888889 | 87.692 |
| 0.7708333333333334 | 87.692 |
| 0.7715277777777777 | 87.692 |
| 0.7722222222222223 | 87.692 |
| 0.7729166666666667 | 87.692 |
| 0.7736111111111111 | 83.205 |
| 0.7743055555555555 | 83.205 |
| 0.775 | 78.722 |
| 0.7756944444444445 | 78.722 |
| 0.7763888888888889 | 74.246 |
| 0.7770833333333332 | 69.775 |
| 0.7777777777777778 | 69.775 |
| 0.7784722222222222 | 69.775 |
| 0.7791666666666667 | 65.31 |
| 0.779861111111111 | 65.31 |
| 0.7805555555555556 | 60.85 |
| 0.78125 | 60.85 |
| 0.7819444444444444 | 56.398 |
| 0.782638888888889 | 56.398 |
| 0.7833333333333333 | 56.398 |
| 0.7840277777777778 | 51.951 |
| 0.7847222222222222 | 51.951 |
| 0.7854166666666668 | 47.511 |
| 0.7861111111111111 | 47.511 |
| 0.7868055555555555 | 43.079 |
| 0.7875 | 43.079 |
| 0.7881944444444445 | 43.079 |
| 0.7888888888888889 | 43.079 |
| 0.7895833333333333 | 43.079 |
| 0.7902777777777777 | 43.079 |
| 0.7909722222222223 | 43.079 |
| 0.7916666666666666 | 43.079 |
| 0.7923611111111111 | 43.079 |
| 0.7930555555555556 | 38.653 |
| 0.7937500000000001 | 38.653 |
| 0.7944444444444444 | 38.653 |
| 0.7951388888888888 | 38.653 |
| 0.7958333333333334 | 38.653 |
| 0.7965277777777778 | 38.653 |
| 0.7972222222222222 | 38.653 |
| 0.7979166666666666 | 34.234 |
| 0.7986111111111112 | 34.234 |
| 0.7993055555555556 | 34.234 |
| 0.7999999999999999 | 34.234 |
| 0.8006944444444444 | 38.653 |
| 0.8013888888888889 | 38.653 |
| 0.8020833333333334 | 38.653 |
| 0.8027777777777777 | 38.653 |
| 0.8034722222222223 | 34.234 |
| 0.8041666666666667 | 34.234 |
| 0.8048611111111111 | 34.234 |
| 0.8055555555555555 | 34.234 |
| 0.80625 | 29.823 |
| 0.8069444444444445 | 29.823 |
| 0.8076388888888889 | 25.419 |
| 0.8083333333333332 | 25.419 |
| 0.8090277777777778 | 25.419 |
| 0.8097222222222222 | 21.024 |
| 0.8104166666666667 | 21.024 |
| 0.811111111111111 | 21.024 |
| 0.8118055555555556 | 16.636 |
| 0.8125 | 16.636 |
| 0.8131944444444444 | 16.636 |
| 0.813888888888889 | 12.257 |
| 0.8145833333333333 | 12.257 |
| 0.8152777777777778 | 12.257 |
| 0.8159722222222222 | 12.257 |
| 0.8166666666666668 | 7.887 |
| 0.8173611111111111 | 7.887 |
| 0.8180555555555555 | 12.257 |
| 0.81875 | 7.887 |
| 0.8194444444444445 | 7.887 |
| 0.8201388888888889 | 7.887 |
| 0.8208333333333333 | 7.887 |
| 0.8215277777777777 | 7.887 |
| 0.8222222222222223 | 7.887 |
| 0.8229166666666666 | 7.887 |
| 0.8236111111111111 | 7.887 |
| 0.8243055555555556 | 7.887 |
| 0.8250000000000001 | 7.887 |
| 0.8256944444444444 | 3.525 |
| 0.8263888888888888 | 3.525 |
| 0.8270833333333334 | 3.525 |
| 0.8277777777777778 | 3.525 |
| 0.8284722222222222 | 3.525 |
| 0.8291666666666666 | 3.525 |
| 0.8298611111111112 | 3.525 |
| 0.8305555555555556 | 3.525 |
| 0.8312499999999999 | 3.525 |
| 0.8319444444444444 | 3.525 |
| 0.8326388888888889 | 3.525 |
| 0.8333333333333334 | 3.525 |
| 0.8340277777777777 | 0 |
| 0.8347222222222223 | 3.525 |
| 0.8354166666666667 | 3.525 |
| 0.8361111111111111 | 0 |
| 0.8368055555555555 | 0 |
| 0.8375 | 0 |
| 0.8381944444444445 | 0 |
| 0.8388888888888889 | 0 |
| 0.8395833333333332 | 0 |
| 0.8402777777777778 | 0 |
| 0.8409722222222222 | 0 |
| 0.8416666666666667 | 0 |
| 0.842361111111111 | 0 |
| 0.8430555555555556 | 0 |
| 0.84375 | 0 |
| 0.8444444444444444 | 0 |
| 0.845138888888889 | 0 |
| 0.8458333333333333 | 0 |
| 0.8465277777777778 | 0 |
| 0.8472222222222222 | 0 |
| 0.8479166666666668 | 0 |
| 0.8486111111111111 | 0 |
| 0.8493055555555555 | 0 |
| 0.85 | 0 |
| 0.8506944444444445 | 0 |
| 0.8513888888888889 | 0 |
| 0.8520833333333333 | 0 |
| 0.8527777777777777 | 0 |
| 0.8534722222222223 | 0 |
| 0.8541666666666666 | 0 |
| 0.8548611111111111 | 0 |
| 0.8555555555555556 | 0 |
| 0.8562500000000001 | 0 |
| 0.8569444444444444 | 0 |
| 0.8576388888888888 | 0 |
| 0.8583333333333334 | 0 |
| 0.8590277777777778 | 0 |
| 0.8597222222222222 | 0 |
| 0.8604166666666666 | 0 |
| 0.8611111111111112 | 0 |
| 0.8618055555555556 | 0 |
| 0.8624999999999999 | 0 |
| 0.8631944444444444 | 0 |
| 0.8638888888888889 | 0 |
| 0.8645833333333334 | 0 |
| 0.8652777777777777 | 0 |
| 0.8659722222222223 | 0 |
| 0.8666666666666667 | 0 |
| 0.8673611111111111 | 0 |
| 0.8680555555555555 | 0 |
| 0.86875 | 0 |
| 0.8694444444444445 | 0 |
| 0.8701388888888889 | 0 |
| 0.8708333333333332 | 0 |
| 0.8715277777777778 | 0 |
| 0.8722222222222222 | 0 |
| 0.8729166666666667 | 0 |
| 0.873611111111111 | 0 |
| 0.8743055555555556 | 0 |
| 0.875 | 0 |
| 0.8756944444444444 | 0 |
| 0.876388888888889 | 0 |
| 0.8770833333333333 | 0 |
| 0.8777777777777778 | 0 |
| 0.8784722222222222 | 0 |
| 0.8791666666666668 | 0 |
| 0.8798611111111111 | 0 |
| 0.8805555555555555 | 0 |
| 0.88125 | 0 |
| 0.8819444444444445 | 0 |
| 0.8826388888888889 | 0 |
| 0.8833333333333333 | 0 |
| 0.8840277777777777 | 0 |
| 0.8847222222222223 | 0 |
| 0.8854166666666666 | 0 |
| 0.8861111111111111 | 0 |
| 0.8868055555555556 | 0 |
| 0.8875000000000001 | 0 |
| 0.8881944444444444 | 0 |
| 0.8888888888888888 | 0 |
| 0.8895833333333334 | 0 |
| 0.8902777777777778 | 0 |
| 0.8909722222222222 | 0 |
| 0.8916666666666666 | 0 |
| 0.8923611111111112 | 0 |
| 0.8930555555555556 | 0 |
| 0.8937499999999999 | 0 |
| 0.8944444444444444 | 0 |
| 0.8951388888888889 | 0 |
| 0.8958333333333334 | 0 |
| 0.8965277777777777 | 0 |
| 0.8972222222222223 | 0 |
| 0.8979166666666667 | 0 |
| 0.8986111111111111 | 0 |
| 0.8993055555555555 | 0 |
| 0.9 | 0 |
| 0.9006944444444445 | 0 |
| 0.9013888888888889 | 0 |
| 0.9020833333333332 | 0 |
| 0.9027777777777778 | 0 |
| 0.9034722222222222 | 0 |
| 0.9041666666666667 | 0 |
| 0.904861111111111 | 0 |
| 0.9055555555555556 | 0 |
| 0.90625 | 0 |
| 0.9069444444444444 | 0 |
| 0.907638888888889 | 0 |
| 0.9083333333333333 | 0 |
| 0.9090277777777778 | 0 |
| 0.9097222222222222 | 0 |
| 0.9104166666666668 | 0 |
| 0.9111111111111111 | 0 |
| 0.9118055555555555 | 0 |
| 0.9125 | 0 |
| 0.9131944444444445 | 0 |
| 0.9138888888888889 | 0 |
| 0.9145833333333333 | 0 |
| 0.9152777777777777 | 0 |
| 0.9159722222222223 | 0 |
| 0.9166666666666666 | 0 |
| 0.9173611111111111 | 0 |
| 0.9180555555555556 | 0 |
| 0.9187500000000001 | 0 |
| 0.9194444444444444 | 0 |
| 0.9201388888888888 | 0 |
| 0.9208333333333334 | 0 |
| 0.9215277777777778 | 0 |
| 0.9222222222222222 | 0 |
| 0.9229166666666666 | 0 |
| 0.9236111111111112 | 0 |
| 0.9243055555555556 | 0 |
| 0.9249999999999999 | 0 |
| 0.9256944444444444 | 0 |
| 0.9263888888888889 | 0 |
| 0.9270833333333334 | 0 |
| 0.9277777777777777 | 0 |
| 0.9284722222222223 | 0 |
| 0.9291666666666667 | 0 |
| 0.9298611111111111 | 0 |
| 0.9305555555555555 | 0 |
| 0.93125 | 0 |
| 0.9319444444444445 | 0 |
| 0.9326388888888889 | 0 |
| 0.9333333333333332 | 0 |
| 0.9340277777777778 | 0 |
| 0.9347222222222222 | 0 |
| 0.9354166666666667 | 0 |
| 0.936111111111111 | 0 |
| 0.9368055555555556 | 0 |
| 0.9375 | 0 |
| 0.9381944444444444 | 0 |
| 0.938888888888889 | 0 |
| 0.9395833333333333 | 0 |
| 0.9402777777777778 | 0 |
| 0.9409722222222222 | 0 |
| 0.9416666666666668 | 0 |
| 0.9423611111111111 | 0 |
| 0.9430555555555555 | 0 |
| 0.94375 | 0 |
| 0.9444444444444445 | 0 |
| 0.9451388888888889 | 0 |
| 0.9458333333333333 | 0 |
| 0.9465277777777777 | 0 |
| 0.9472222222222223 | 0 |
| 0.9479166666666666 | 0 |
| 0.9486111111111111 | 0 |
| 0.9493055555555556 | 0 |
| 0.9500000000000001 | 0 |
| 0.9506944444444444 | 0 |
| 0.9513888888888888 | 0 |
| 0.9520833333333334 | 0 |
| 0.9527777777777778 | 0 |
| 0.9534722222222222 | 0 |
| 0.9541666666666666 | 0 |
| 0.9548611111111112 | 0 |
| 0.9555555555555556 | 0 |
| 0.9562499999999999 | 0 |
| 0.9569444444444444 | 0 |
| 0.9576388888888889 | 0 |
| 0.9583333333333334 | 0 |
| 0.9590277777777777 | 0 |
| 0.9597222222222223 | 0 |
| 0.9604166666666667 | 0 |
| 0.9611111111111111 | 0 |
| 0.9618055555555555 | 0 |
| 0.9625 | 0 |
| 0.9631944444444445 | 0 |
| 0.9638888888888889 | 0 |
| 0.9645833333333332 | 0 |
| 0.9652777777777778 | 0 |
| 0.9659722222222222 | 0 |
| 0.9666666666666667 | 0 |
| 0.967361111111111 | 0 |
| 0.9680555555555556 | 0 |
| 0.96875 | 0 |
| 0.9694444444444444 | 0 |
| 0.970138888888889 | 0 |
| 0.9708333333333333 | 0 |
| 0.9715277777777778 | 0 |
| 0.9722222222222222 | 0 |
| 0.9729166666666668 | 0 |
| 0.9736111111111111 | 0 |
| 0.9743055555555555 | 0 |
| 0.975 | 0 |
| 0.9756944444444445 | 0 |
| 0.9763888888888889 | 0 |
| 0.9770833333333333 | 0 |
| 0.9777777777777777 | 0 |
| 0.9784722222222223 | 0 |
| 0.9791666666666666 | 0 |
| 0.9798611111111111 | 0 |
| 0.9805555555555556 | 0 |
| 0.9812500000000001 | 0 |
| 0.9819444444444444 | 0 |
| 0.9826388888888888 | 0 |
| 0.9833333333333334 | 0 |
| 0.9840277777777778 | 0 |
| 0.9847222222222222 | 0 |
| 0.9854166666666666 | 0 |
| 0.9861111111111112 | 0 |
| 0.9868055555555556 | 0 |
| 0.9874999999999999 | 0 |
| 0.9881944444444444 | 0 |
| 0.9888888888888889 | 0 |
| 0.9895833333333334 | 0 |
| 0.9902777777777777 | 0 |
| 0.9909722222222223 | 0 |
| 0.9916666666666667 | 0 |
| 0.9923611111111111 | 0 |
| 0.9930555555555555 | 0 |
| 0.99375 | 0 |
| 0.9944444444444445 | 0 |
| 0.9951388888888889 | 0 |
| 0.9958333333333332 | 0 |
| 0.9965277777777778 | 0 |
| 0.9972222222222222 | 0 |
| 0.9979166666666667 | 0 |
| 0.998611111111111 | 0 |
| 0.9993055555555556 | 0 |